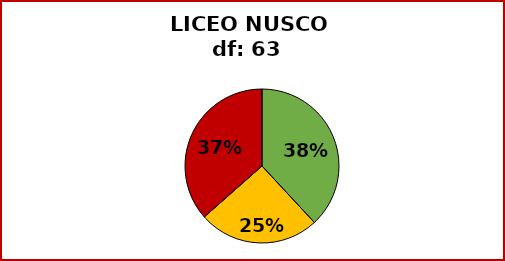
| Category | TOT  |
|---|---|
| SUPERATI | 24 |
| PARZIAL.NTE SUPERATI | 16 |
| NON SUPERATI | 23 |